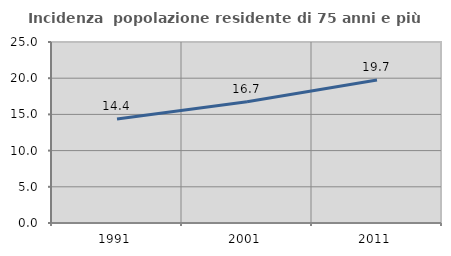
| Category | Incidenza  popolazione residente di 75 anni e più |
|---|---|
| 1991.0 | 14.371 |
| 2001.0 | 16.741 |
| 2011.0 | 19.747 |